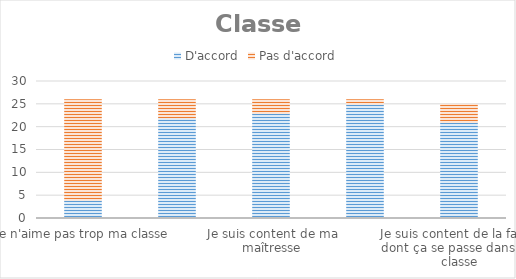
| Category | D'accord | Pas d'accord |
|---|---|---|
| Je n'aime pas trop ma classe | 4 | 22 |
| Je suis content d'être dans ma classe | 22 | 4 |
| Je suis content de ma maîtresse | 23 | 3 |
| Je suis content de ma salle de classe | 25 | 1 |
| Je suis content de la façon dont ça se passe dans ma classe | 21 | 4 |